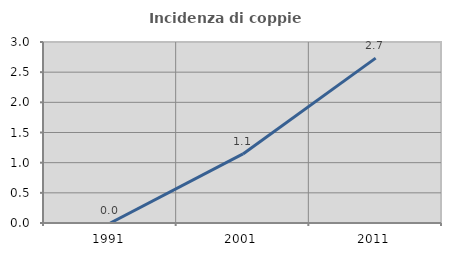
| Category | Incidenza di coppie miste |
|---|---|
| 1991.0 | 0 |
| 2001.0 | 1.145 |
| 2011.0 | 2.732 |